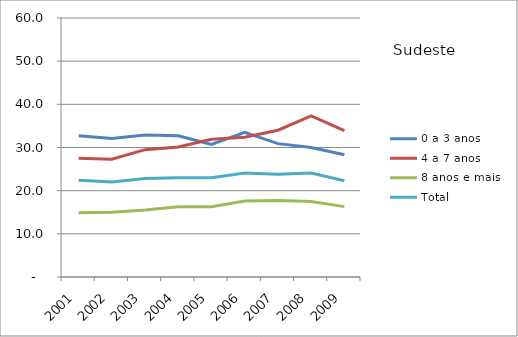
| Category | 0 a 3 anos | 4 a 7 anos | 8 anos e mais | Total |
|---|---|---|---|---|
| 2001.0 | 32.7 | 27.5 | 14.9 | 22.4 |
| 2002.0 | 32.1 | 27.3 | 15 | 22 |
| 2003.0 | 32.9 | 29.5 | 15.5 | 22.8 |
| 2004.0 | 32.7 | 30.1 | 16.3 | 23 |
| 2005.0 | 30.7 | 31.9 | 16.3 | 23 |
| 2006.0 | 33.5 | 32.4 | 17.6 | 24.1 |
| 2007.0 | 30.9 | 34 | 17.7 | 23.8 |
| 2008.0 | 30 | 37.3 | 17.5 | 24.1 |
| 2009.0 | 28.3 | 33.9 | 16.3 | 22.3 |